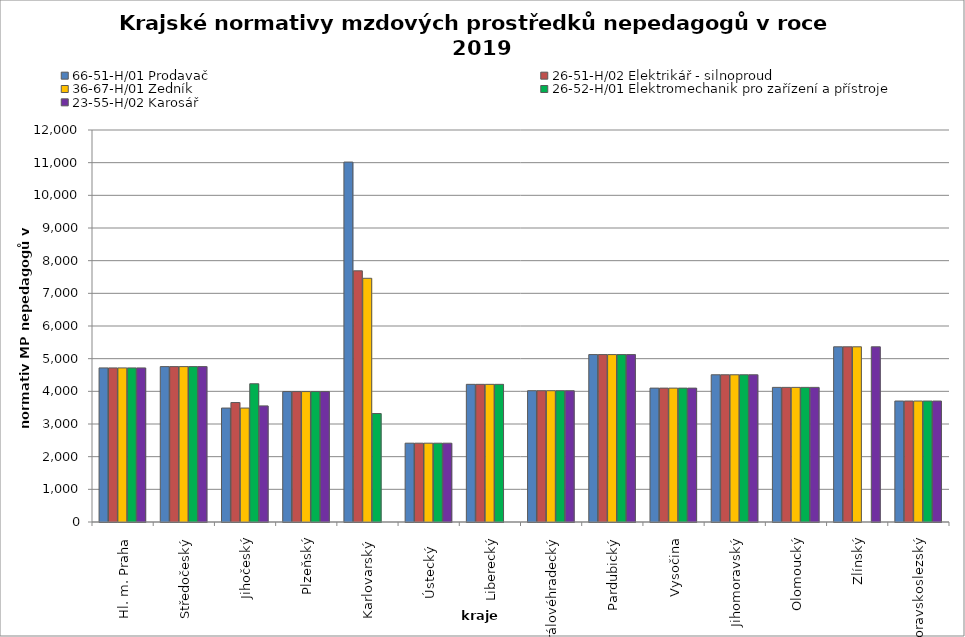
| Category | 66-51-H/01 Prodavač | 26-51-H/02 Elektrikář - silnoproud | 36-67-H/01 Zedník | 26-52-H/01 Elektromechanik pro zařízení a přístroje | 23-55-H/02 Karosář |
|---|---|---|---|---|---|
| Hl. m. Praha | 4716.774 | 4716.774 | 4716.774 | 4716.774 | 4716.774 |
| Středočeský | 4756.8 | 4756.8 | 4756.8 | 4756.8 | 4756.8 |
| Jihočeský | 3488.344 | 3656.976 | 3488.344 | 4232 | 3554.652 |
| Plzeňský | 3992.727 | 3992.727 | 3992.727 | 3992.727 | 3992.727 |
| Karlovarský  | 11018.182 | 7689.136 | 7460.757 | 3320.548 | 0 |
| Ústecký   | 2412.866 | 2412.866 | 2412.866 | 2412.866 | 2412.866 |
| Liberecký | 4214.357 | 4214.357 | 4214.357 | 4214.357 | 0 |
| Královéhradecký | 4018.825 | 4018.825 | 4018.825 | 4018.825 | 4018.825 |
| Pardubický | 5125.091 | 5125.091 | 5125.091 | 5125.091 | 5125.091 |
| Vysočina | 4098.617 | 4098.617 | 4098.617 | 4098.617 | 4098.617 |
| Jihomoravský | 4506.792 | 4506.792 | 4506.792 | 4506.792 | 4506.792 |
| Olomoucký | 4120.751 | 4120.751 | 4120.751 | 4120.751 | 4120.751 |
| Zlínský | 5363.265 | 5363.265 | 5363.265 | 0 | 5363.265 |
| Moravskoslezský | 3703.244 | 3703.244 | 3703.244 | 3703.244 | 3703.244 |